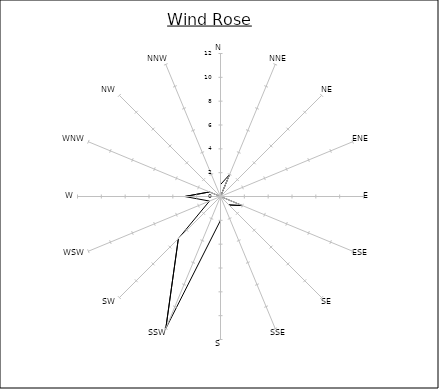
| Category | Series 0 |
|---|---|
| N | 1 |
| NNE | 2 |
| NE | 0 |
| ENE | 0 |
| E | 0 |
| ESE | 2 |
| SE | 1 |
| SSE | 0 |
| S | 2 |
| SSW | 12 |
| SW | 5 |
| WSW | 1 |
| W | 3 |
| WNW | 1 |
| NW | 0 |
| NNW | 0 |